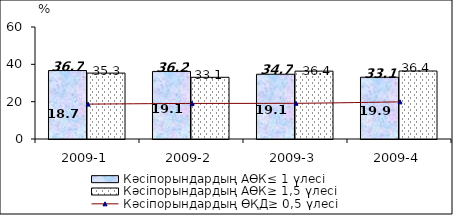
| Category | Кәсіпорындардың АӨК≤ 1 үлесі | Кәсіпорындардың АӨК≥ 1,5 үлесі |
|---|---|---|
| 2009-1 | 36.676 | 35.313 |
| 2009-2 | 36.196 | 33.05 |
| 2009-3 | 34.694 | 36.355 |
| 2009-4 | 33.091 | 36.421 |